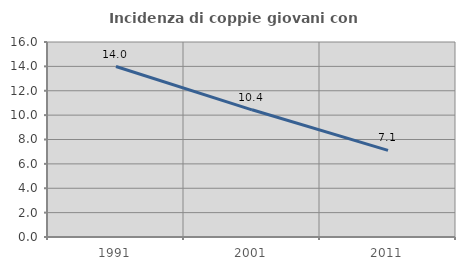
| Category | Incidenza di coppie giovani con figli |
|---|---|
| 1991.0 | 13.989 |
| 2001.0 | 10.436 |
| 2011.0 | 7.107 |